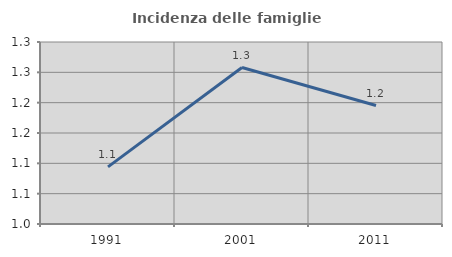
| Category | Incidenza delle famiglie numerose |
|---|---|
| 1991.0 | 1.094 |
| 2001.0 | 1.258 |
| 2011.0 | 1.195 |